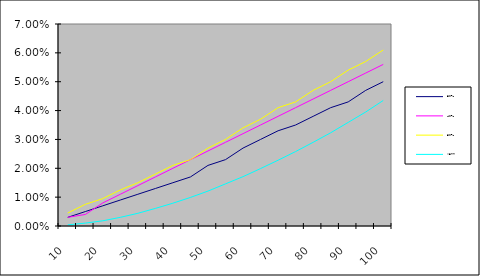
| Category | 30 % | 40 % | 50 % | Vann |
|---|---|---|---|---|
| 10.0 | 0.003 | 0.003 | 0.004 | 0 |
| 15.0 | 0.005 | 0.004 | 0.008 | 0.001 |
| 20.0 | 0.007 | 0.008 | 0.01 | 0.002 |
| 25.0 | 0.009 | 0.011 | 0.012 | 0.003 |
| 30.0 | 0.011 | 0.014 | 0.015 | 0.004 |
| 35.0 | 0.013 | 0.017 | 0.018 | 0.006 |
| 40.0 | 0.015 | 0.02 | 0.021 | 0.008 |
| 45.0 | 0.017 | 0.023 | 0.023 | 0.01 |
| 50.0 | 0.021 | 0.026 | 0.027 | 0.012 |
| 55.0 | 0.023 | 0.029 | 0.03 | 0.015 |
| 60.0 | 0.027 | 0.032 | 0.034 | 0.017 |
| 65.0 | 0.03 | 0.035 | 0.037 | 0.02 |
| 70.0 | 0.033 | 0.038 | 0.041 | 0.023 |
| 75.0 | 0.035 | 0.041 | 0.043 | 0.026 |
| 80.0 | 0.038 | 0.044 | 0.047 | 0.029 |
| 85.0 | 0.041 | 0.047 | 0.05 | 0.032 |
| 90.0 | 0.043 | 0.05 | 0.054 | 0.036 |
| 95.0 | 0.047 | 0.053 | 0.057 | 0.04 |
| 100.0 | 0.05 | 0.056 | 0.061 | 0.044 |